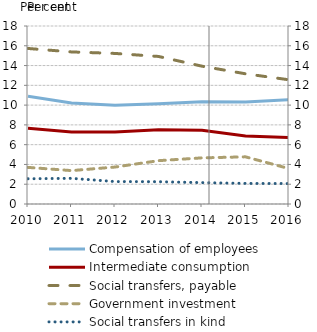
| Category | Compensation of employees | Intermediate consumption | Social transfers, payable | Government investment |
|---|---|---|---|---|
| 2010.0 | 10.896 | 7.65 | 15.728 | 3.703 |
| 2011.0 | 10.225 | 7.294 | 15.378 | 3.377 |
| 2012.0 | 9.981 | 7.286 | 15.226 | 3.736 |
| 2013.0 | 10.146 | 7.496 | 14.921 | 4.382 |
| 2014.0 | 10.347 | 7.458 | 13.936 | 4.666 |
| 2015.0 | 10.322 | 6.873 | 13.167 | 4.769 |
| 2016.0 | 10.545 | 6.729 | 12.56 | 3.58 |